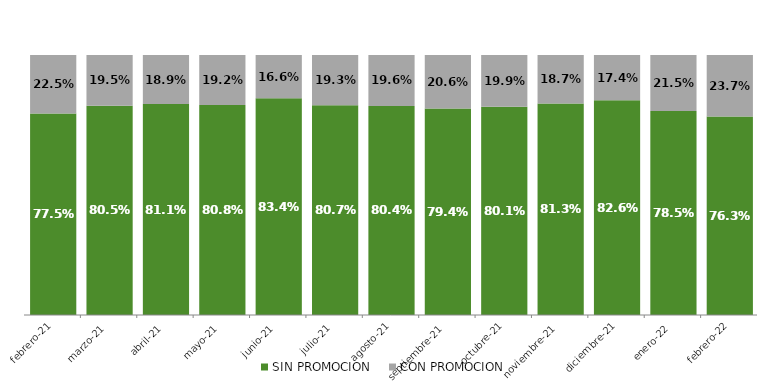
| Category | SIN PROMOCION   | CON PROMOCION   |
|---|---|---|
| 2021-02-01 | 0.775 | 0.225 |
| 2021-03-01 | 0.805 | 0.195 |
| 2021-04-01 | 0.811 | 0.189 |
| 2021-05-01 | 0.808 | 0.192 |
| 2021-06-01 | 0.834 | 0.166 |
| 2021-07-01 | 0.807 | 0.193 |
| 2021-08-01 | 0.804 | 0.196 |
| 2021-09-01 | 0.794 | 0.206 |
| 2021-10-01 | 0.801 | 0.199 |
| 2021-11-01 | 0.813 | 0.187 |
| 2021-12-01 | 0.826 | 0.174 |
| 2022-01-01 | 0.785 | 0.215 |
| 2022-02-01 | 0.763 | 0.237 |